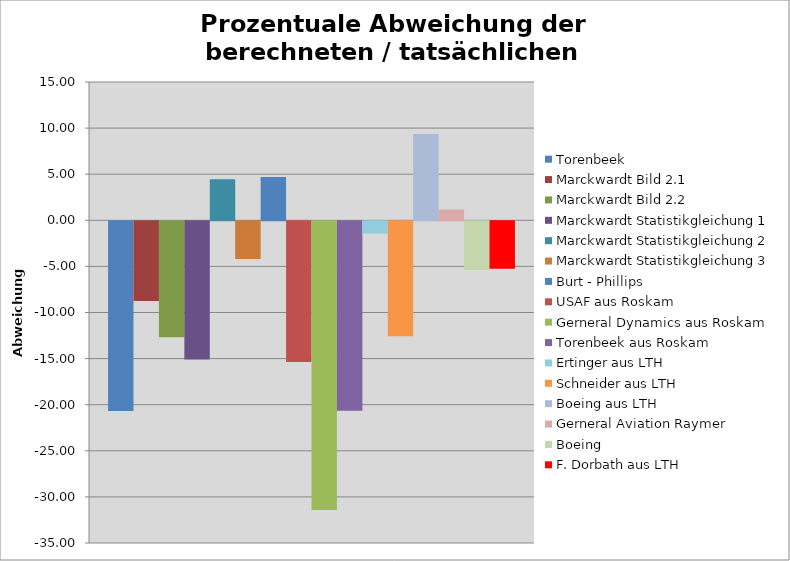
| Category | Torenbeek | Marckwardt Bild 2.1 | Marckwardt Bild 2.2 | Marckwardt Statistikgleichung 1 | Marckwardt Statistikgleichung 2 | Marckwardt Statistikgleichung 3 | Burt - Phillips | USAF aus Roskam | Gerneral Dynamics aus Roskam | Torenbeek aus Roskam | Ertinger aus LTH | Schneider aus LTH | Boeing aus LTH | Gerneral Aviation Raymer | Boeing | F. Dorbath aus LTH |
|---|---|---|---|---|---|---|---|---|---|---|---|---|---|---|---|---|
| 0 | -20.583 | -8.656 | -12.574 | -14.992 | 4.458 | -4.091 | 4.706 | -15.262 | -31.322 | -20.54 | -1.317 | -12.455 | 9.369 | 1.166 | -5.289 | -5.137 |